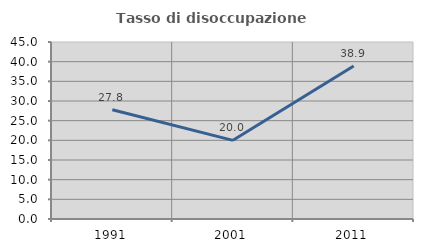
| Category | Tasso di disoccupazione giovanile  |
|---|---|
| 1991.0 | 27.778 |
| 2001.0 | 20 |
| 2011.0 | 38.889 |